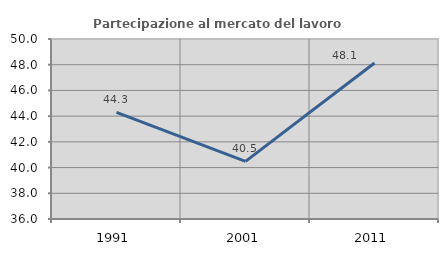
| Category | Partecipazione al mercato del lavoro  femminile |
|---|---|
| 1991.0 | 44.294 |
| 2001.0 | 40.484 |
| 2011.0 | 48.135 |